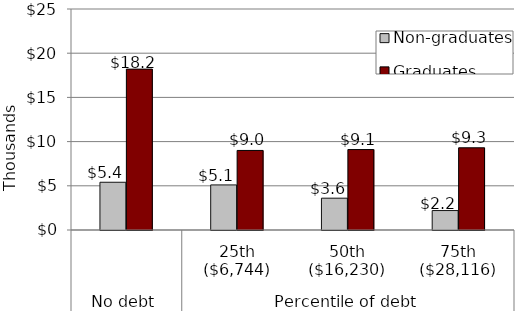
| Category | Non-graduates | Graduates |
|---|---|---|
| 0 | 5400 | 18200 |
| 1 | 5100 | 9000 |
| 2 | 3600 | 9100 |
| 3 | 2200 | 9300 |